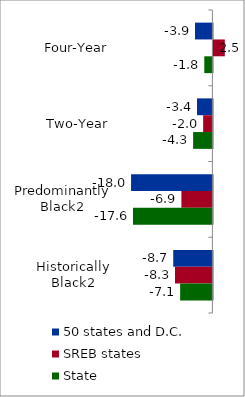
| Category | 50 states and D.C. | SREB states | State |
|---|---|---|---|
| Four-Year | -3.853 | 2.524 | -1.795 |
| Two-Year | -3.409 | -2.047 | -4.266 |
| Predominantly Black2 | -17.996 | -6.859 | -17.567 |
| Historically Black2 | -8.666 | -8.273 | -7.137 |